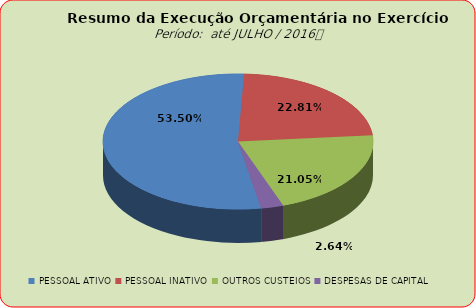
| Category | Series 0 |
|---|---|
| PESSOAL ATIVO | 78723115.91 |
| PESSOAL INATIVO | 33570660.65 |
| OUTROS CUSTEIOS | 30977951.11 |
| DESPESAS DE CAPITAL | 3877657.78 |